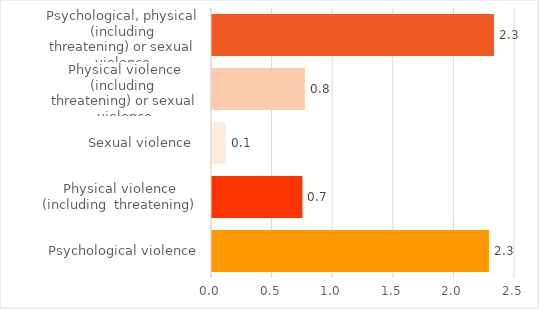
| Category | Series 0 |
|---|---|
| Psychological violence | 2.285 |
| Physical violence
(including  threatening) | 0.746 |
| Sexual violence  | 0.114 |
| Physical violence (including 
threatening) or sexual violence | 0.766 |
| Psychological, physical (including
threatening) or sexual violence | 2.327 |